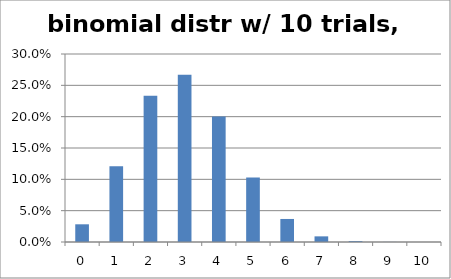
| Category | 0.3 |
|---|---|
| 0.0 | 0.028 |
| 1.0 | 0.121 |
| 2.0 | 0.233 |
| 3.0 | 0.267 |
| 4.0 | 0.2 |
| 5.0 | 0.103 |
| 6.0 | 0.037 |
| 7.0 | 0.009 |
| 8.0 | 0.001 |
| 9.0 | 0 |
| 10.0 | 0 |